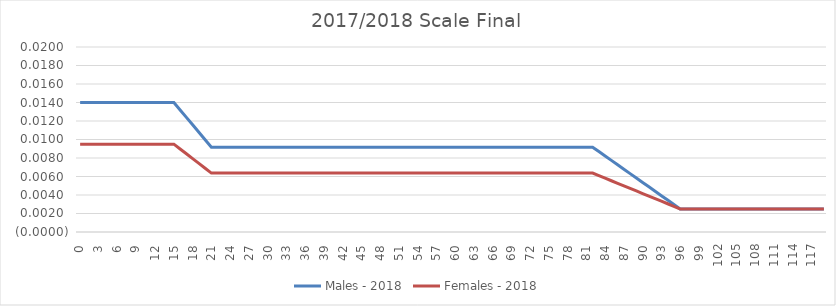
| Category |  Males - 2018  |  Females - 2018  |
|---|---|---|
| 0.0 | 0.014 | 0.01 |
| 1.0 | 0.014 | 0.01 |
| 2.0 | 0.014 | 0.01 |
| 3.0 | 0.014 | 0.01 |
| 4.0 | 0.014 | 0.01 |
| 5.0 | 0.014 | 0.01 |
| 6.0 | 0.014 | 0.01 |
| 7.0 | 0.014 | 0.01 |
| 8.0 | 0.014 | 0.01 |
| 9.0 | 0.014 | 0.01 |
| 10.0 | 0.014 | 0.01 |
| 11.0 | 0.014 | 0.01 |
| 12.0 | 0.014 | 0.01 |
| 13.0 | 0.014 | 0.01 |
| 14.0 | 0.014 | 0.01 |
| 15.0 | 0.014 | 0.01 |
| 16.0 | 0.013 | 0.009 |
| 17.0 | 0.012 | 0.008 |
| 18.0 | 0.012 | 0.008 |
| 19.0 | 0.011 | 0.007 |
| 20.0 | 0.01 | 0.007 |
| 21.0 | 0.009 | 0.006 |
| 22.0 | 0.009 | 0.006 |
| 23.0 | 0.009 | 0.006 |
| 24.0 | 0.009 | 0.006 |
| 25.0 | 0.009 | 0.006 |
| 26.0 | 0.009 | 0.006 |
| 27.0 | 0.009 | 0.006 |
| 28.0 | 0.009 | 0.006 |
| 29.0 | 0.009 | 0.006 |
| 30.0 | 0.009 | 0.006 |
| 31.0 | 0.009 | 0.006 |
| 32.0 | 0.009 | 0.006 |
| 33.0 | 0.009 | 0.006 |
| 34.0 | 0.009 | 0.006 |
| 35.0 | 0.009 | 0.006 |
| 36.0 | 0.009 | 0.006 |
| 37.0 | 0.009 | 0.006 |
| 38.0 | 0.009 | 0.006 |
| 39.0 | 0.009 | 0.006 |
| 40.0 | 0.009 | 0.006 |
| 41.0 | 0.009 | 0.006 |
| 42.0 | 0.009 | 0.006 |
| 43.0 | 0.009 | 0.006 |
| 44.0 | 0.009 | 0.006 |
| 45.0 | 0.009 | 0.006 |
| 46.0 | 0.009 | 0.006 |
| 47.0 | 0.009 | 0.006 |
| 48.0 | 0.009 | 0.006 |
| 49.0 | 0.009 | 0.006 |
| 50.0 | 0.009 | 0.006 |
| 51.0 | 0.009 | 0.006 |
| 52.0 | 0.009 | 0.006 |
| 53.0 | 0.009 | 0.006 |
| 54.0 | 0.009 | 0.006 |
| 55.0 | 0.009 | 0.006 |
| 56.0 | 0.009 | 0.006 |
| 57.0 | 0.009 | 0.006 |
| 58.0 | 0.009 | 0.006 |
| 59.0 | 0.009 | 0.006 |
| 60.0 | 0.009 | 0.006 |
| 61.0 | 0.009 | 0.006 |
| 62.0 | 0.009 | 0.006 |
| 63.0 | 0.009 | 0.006 |
| 64.0 | 0.009 | 0.006 |
| 65.0 | 0.009 | 0.006 |
| 66.0 | 0.009 | 0.006 |
| 67.0 | 0.009 | 0.006 |
| 68.0 | 0.009 | 0.006 |
| 69.0 | 0.009 | 0.006 |
| 70.0 | 0.009 | 0.006 |
| 71.0 | 0.009 | 0.006 |
| 72.0 | 0.009 | 0.006 |
| 73.0 | 0.009 | 0.006 |
| 74.0 | 0.009 | 0.006 |
| 75.0 | 0.009 | 0.006 |
| 76.0 | 0.009 | 0.006 |
| 77.0 | 0.009 | 0.006 |
| 78.0 | 0.009 | 0.006 |
| 79.0 | 0.009 | 0.006 |
| 80.0 | 0.009 | 0.006 |
| 81.0 | 0.009 | 0.006 |
| 82.0 | 0.009 | 0.006 |
| 83.0 | 0.009 | 0.006 |
| 84.0 | 0.008 | 0.006 |
| 85.0 | 0.008 | 0.006 |
| 86.0 | 0.007 | 0.005 |
| 87.0 | 0.007 | 0.005 |
| 88.0 | 0.006 | 0.005 |
| 89.0 | 0.006 | 0.004 |
| 90.0 | 0.005 | 0.004 |
| 91.0 | 0.005 | 0.004 |
| 92.0 | 0.004 | 0.004 |
| 93.0 | 0.004 | 0.003 |
| 94.0 | 0.003 | 0.003 |
| 95.0 | 0.003 | 0.003 |
| 96.0 | 0.002 | 0.002 |
| 97.0 | 0.002 | 0.002 |
| 98.0 | 0.002 | 0.002 |
| 99.0 | 0.002 | 0.002 |
| 100.0 | 0.002 | 0.002 |
| 101.0 | 0.002 | 0.002 |
| 102.0 | 0.002 | 0.002 |
| 103.0 | 0.002 | 0.002 |
| 104.0 | 0.002 | 0.002 |
| 105.0 | 0.002 | 0.002 |
| 106.0 | 0.002 | 0.002 |
| 107.0 | 0.002 | 0.002 |
| 108.0 | 0.002 | 0.002 |
| 109.0 | 0.002 | 0.002 |
| 110.0 | 0.002 | 0.002 |
| 111.0 | 0.002 | 0.002 |
| 112.0 | 0.002 | 0.002 |
| 113.0 | 0.002 | 0.002 |
| 114.0 | 0.002 | 0.002 |
| 115.0 | 0.002 | 0.002 |
| 116.0 | 0.002 | 0.002 |
| 117.0 | 0.002 | 0.002 |
| 118.0 | 0.002 | 0.002 |
| 119.0 | 0.002 | 0.002 |